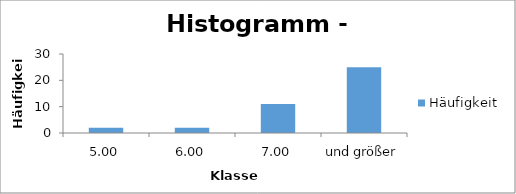
| Category | Häufigkeit |
|---|---|
| 5.00 | 2 |
| 6.00 | 2 |
| 7.00 | 11 |
| und größer | 25 |